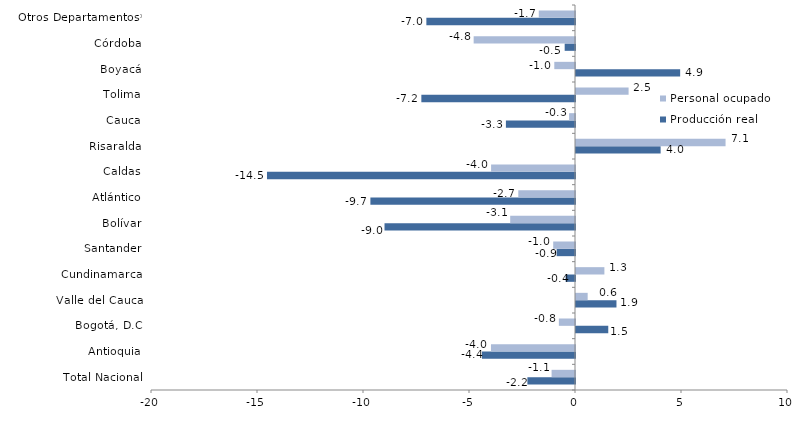
| Category | Producción real | Personal ocupado |
|---|---|---|
| Total Nacional | -2.246 | -1.105 |
| Antioquia | -4.387 | -3.964 |
| Bogotá, D.C | 1.522 | -0.761 |
| Valle del Cauca | 1.909 | 0.55 |
| Cundinamarca | -0.445 | 1.339 |
| Santander | -0.865 | -1.028 |
| Bolívar | -8.985 | -3.057 |
| Atlántico | -9.651 | -2.674 |
| Caldas | -14.529 | -3.958 |
| Risaralda | 3.992 | 7.055 |
| Cauca | -3.259 | -0.277 |
| Tolima | -7.248 | 2.48 |
| Boyacá | 4.913 | -0.977 |
| Córdoba | -0.487 | -4.78 |
| Otros Departamentos* | -7.011 | -1.709 |